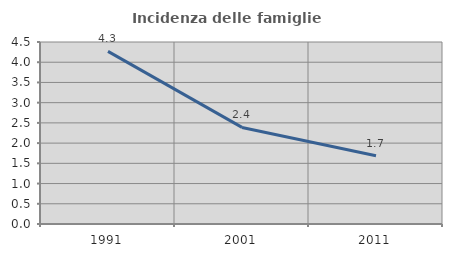
| Category | Incidenza delle famiglie numerose |
|---|---|
| 1991.0 | 4.267 |
| 2001.0 | 2.388 |
| 2011.0 | 1.69 |